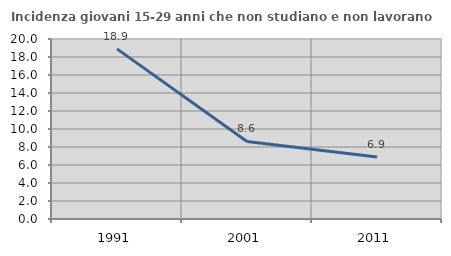
| Category | Incidenza giovani 15-29 anni che non studiano e non lavorano  |
|---|---|
| 1991.0 | 18.905 |
| 2001.0 | 8.616 |
| 2011.0 | 6.897 |